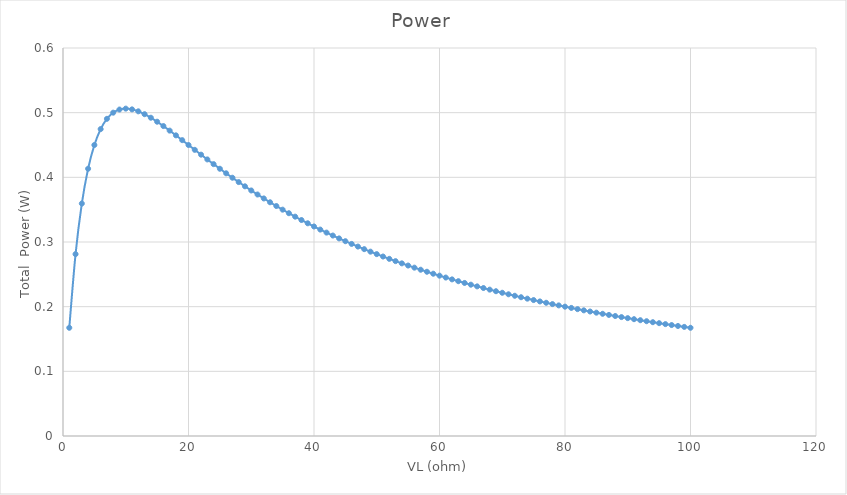
| Category | Series 0 |
|---|---|
| 1.0 | 0.167 |
| 2.0 | 0.281 |
| 3.0 | 0.359 |
| 4.0 | 0.413 |
| 5.0 | 0.45 |
| 6.0 | 0.475 |
| 7.0 | 0.49 |
| 8.0 | 0.5 |
| 9.0 | 0.505 |
| 10.0 | 0.506 |
| 11.0 | 0.505 |
| 12.0 | 0.502 |
| 13.0 | 0.498 |
| 14.0 | 0.492 |
| 15.0 | 0.486 |
| 16.0 | 0.479 |
| 17.0 | 0.472 |
| 18.0 | 0.465 |
| 19.0 | 0.457 |
| 20.0 | 0.45 |
| 21.0 | 0.443 |
| 22.0 | 0.435 |
| 23.0 | 0.428 |
| 24.0 | 0.42 |
| 25.0 | 0.413 |
| 26.0 | 0.406 |
| 27.0 | 0.399 |
| 28.0 | 0.393 |
| 29.0 | 0.386 |
| 30.0 | 0.38 |
| 31.0 | 0.373 |
| 32.0 | 0.367 |
| 33.0 | 0.361 |
| 34.0 | 0.356 |
| 35.0 | 0.35 |
| 36.0 | 0.345 |
| 37.0 | 0.339 |
| 38.0 | 0.334 |
| 39.0 | 0.329 |
| 40.0 | 0.324 |
| 41.0 | 0.319 |
| 42.0 | 0.315 |
| 43.0 | 0.31 |
| 44.0 | 0.306 |
| 45.0 | 0.301 |
| 46.0 | 0.297 |
| 47.0 | 0.293 |
| 48.0 | 0.289 |
| 49.0 | 0.285 |
| 50.0 | 0.281 |
| 51.0 | 0.278 |
| 52.0 | 0.274 |
| 53.0 | 0.27 |
| 54.0 | 0.267 |
| 55.0 | 0.264 |
| 56.0 | 0.26 |
| 57.0 | 0.257 |
| 58.0 | 0.254 |
| 59.0 | 0.251 |
| 60.0 | 0.248 |
| 61.0 | 0.245 |
| 62.0 | 0.242 |
| 63.0 | 0.239 |
| 64.0 | 0.237 |
| 65.0 | 0.234 |
| 66.0 | 0.231 |
| 67.0 | 0.229 |
| 68.0 | 0.226 |
| 69.0 | 0.224 |
| 70.0 | 0.221 |
| 71.0 | 0.219 |
| 72.0 | 0.217 |
| 73.0 | 0.215 |
| 74.0 | 0.212 |
| 75.0 | 0.21 |
| 76.0 | 0.208 |
| 77.0 | 0.206 |
| 78.0 | 0.204 |
| 79.0 | 0.202 |
| 80.0 | 0.2 |
| 81.0 | 0.198 |
| 82.0 | 0.196 |
| 83.0 | 0.194 |
| 84.0 | 0.193 |
| 85.0 | 0.191 |
| 86.0 | 0.189 |
| 87.0 | 0.187 |
| 88.0 | 0.186 |
| 89.0 | 0.184 |
| 90.0 | 0.182 |
| 91.0 | 0.181 |
| 92.0 | 0.179 |
| 93.0 | 0.178 |
| 94.0 | 0.176 |
| 95.0 | 0.174 |
| 96.0 | 0.173 |
| 97.0 | 0.172 |
| 98.0 | 0.17 |
| 99.0 | 0.169 |
| 100.0 | 0.167 |